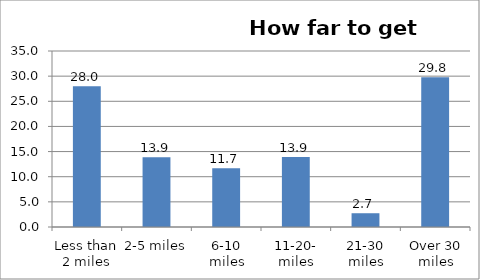
| Category | Series 0 |
|---|---|
| Less than 2 miles | 27.981 |
| 2-5 miles | 13.88 |
| 6-10 miles | 11.687 |
| 11-20- miles | 13.922 |
| 21-30 miles | 2.738 |
| Over 30 miles | 29.792 |